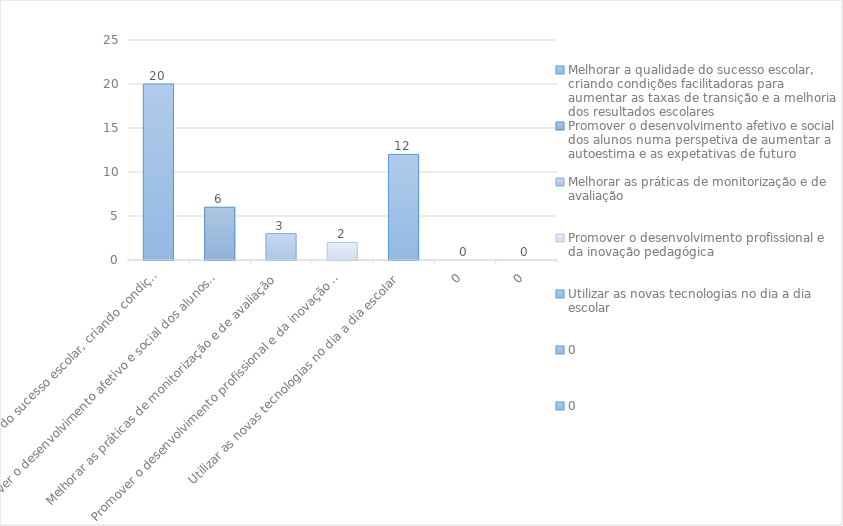
| Category | Series 0 |
|---|---|
| Melhorar a qualidade do sucesso escolar, criando condições facilitadoras para aumentar as taxas de transição e a melhoria dos resultados escolares | 20 |
| Promover o desenvolvimento afetivo e social dos alunos numa perspetiva de aumentar a autoestima e as expetativas de futuro | 6 |
| Melhorar as práticas de monitorização e de avaliação | 3 |
| Promover o desenvolvimento profissional e da inovação pedagógica | 2 |
| Utilizar as novas tecnologias no dia a dia escolar | 12 |
| 0 | 0 |
| 0 | 0 |